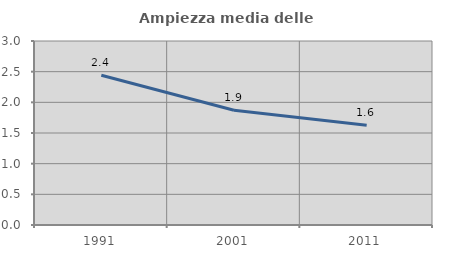
| Category | Ampiezza media delle famiglie |
|---|---|
| 1991.0 | 2.443 |
| 2001.0 | 1.87 |
| 2011.0 | 1.625 |